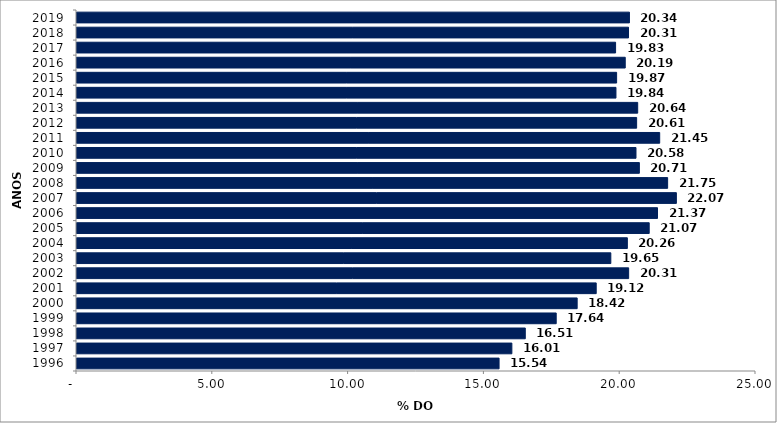
| Category | Series 0 |
|---|---|
| 1996 | 15.54 |
| 1997 | 16.011 |
| 1998 | 16.505 |
| 1999 | 17.644 |
| 2000 | 18.415 |
| 2001 | 19.117 |
| 2002 | 20.311 |
| 2003 | 19.654 |
| 2004 | 20.264 |
| 2005 | 21.068 |
| 2006 | 21.374 |
| 2007 | 22.069 |
| 2008 | 21.746 |
| 2009 | 20.706 |
| 2010 | 20.581 |
| 2011 | 21.454 |
| 2012 | 20.605 |
| 2013 | 20.644 |
| 2014 | 19.844 |
| 2015 | 19.868 |
| 2016 | 20.186 |
| 2017 | 19.83 |
| 2018 | 20.306 |
| 2019 | 20.34 |